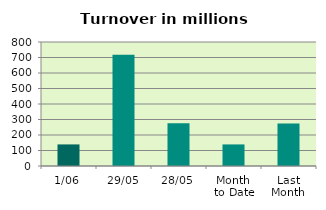
| Category | Series 0 |
|---|---|
| 1/06 | 139.237 |
| 29/05 | 717.463 |
| 28/05 | 275.616 |
| Month 
to Date | 139.237 |
| Last
Month | 273.813 |